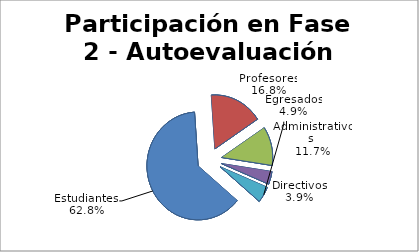
| Category | Series 0 |
|---|---|
| Estudiantes | 3132 |
| Profesores | 839 |
| Administrativos  | 582 |
| Directivos | 193 |
| Egresados | 243 |